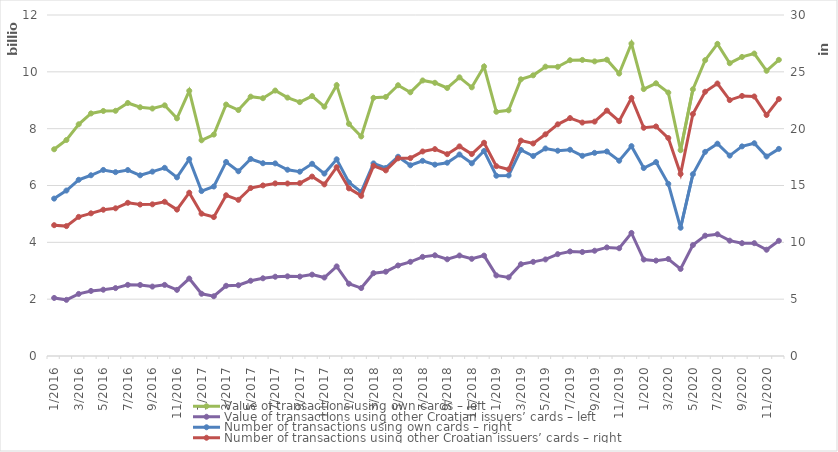
| Category | Value of transactions using own cards – left | Value of transactions using other Croatian issuers’ cards – left |
|---|---|---|
| 1/2016 | 7274581698 | 2043165117 |
| 2/2016 | 7601069776 | 1975751262 |
| 3/2016 | 8154515803 | 2184810922 |
| 4/2016 | 8536006184 | 2289803134 |
| 5/2016 | 8622612405 | 2332785770 |
| 6/2016 | 8629034970 | 2389942571 |
| 7/2016 | 8904025504 | 2503371795 |
| 8/2016 | 8753008570 | 2499535388 |
| 9/2016 | 8709318074 | 2442949613 |
| 10/2016 | 8820702928 | 2502592179 |
| 11/2016 | 8362820758 | 2327194409 |
| 12/2016 | 9332637687 | 2726346925 |
| 1/2017 | 7591025836 | 2190190557 |
| 2/2017 | 7792091469 | 2102919551 |
| 3/2017 | 8848645928 | 2470655643 |
| 4/2017 | 8654763470 | 2490413036 |
| 5/2017 | 9126642889 | 2647280887 |
| 6/2017 | 9071446663 | 2734513423 |
| 7/2017 | 9341412109 | 2789614122 |
| 8/2017 | 9092498823 | 2803821568 |
| 9/2017 | 8934029593 | 2794823429 |
| 10/2017 | 9146073082 | 2863098138 |
| 11/2017 | 8773453563 | 2761213299 |
| 12/2017 | 9531190603 | 3152876747 |
| 1/2018 | 8168175334 | 2542574875 |
| 2/2018 | 7725941801 | 2391117281 |
| 3/2018 | 9086640838 | 2914332631 |
| 4/2018 | 9115284060 | 2966306244 |
| 5/2018 | 9527954881 | 3185636011 |
| 6/2018 | 9280524587 | 3314142126 |
| 7/2018 | 9696345600 | 3488598427 |
| 8/2018 | 9614295639 | 3543480093 |
| 9/2018 | 9431237907 | 3404262357 |
| 10/2018 | 9805876605 | 3535796062 |
| 11/2018 | 9454012098 | 3420077230 |
| 12/2018 | 10187270578 | 3533090860 |
| 1/2019 | 8594592220 | 2836141446 |
| 2/2019 | 8647096820 | 2767304477 |
| 3/2019 | 9736761363 | 3229660568 |
| 4/2019 | 9877345789 | 3313084092 |
| 5/2019 | 10182036882 | 3398328018 |
| 6/2019 | 10176486842 | 3584876239 |
| 7/2019 | 10407918601 | 3680350813 |
| 8/2019 | 10419305536 | 3659303372 |
| 9/2019 | 10368012809 | 3704414714 |
| 10/2019 | 10426377072 | 3820842167 |
| 11/2019 | 9939836838 | 3792181757 |
| 12/2019 | 10995454054 | 4330061303 |
| 1/2020 | 9392971071 | 3394997745 |
| 2/2020 | 9596343289 | 3356402585 |
| 3/2020 | 9270311681 | 3413590643 |
| 4/2020 | 7241288338 | 3064119186 |
| 5/2020 | 9384051642 | 3903171773 |
| 6/2020 | 10410842157 | 4234322339 |
| 7/2020 | 10984235161 | 4283742289 |
| 8/2020 | 10303895284 | 4058502077 |
| 9/2020 | 10524852031 | 3969807463 |
| 10/2020 | 10643592973 | 3970466726 |
| 11/2020 | 10037266927 | 3739742789 |
| 12/2020 | 10421426619 | 4053986928 |